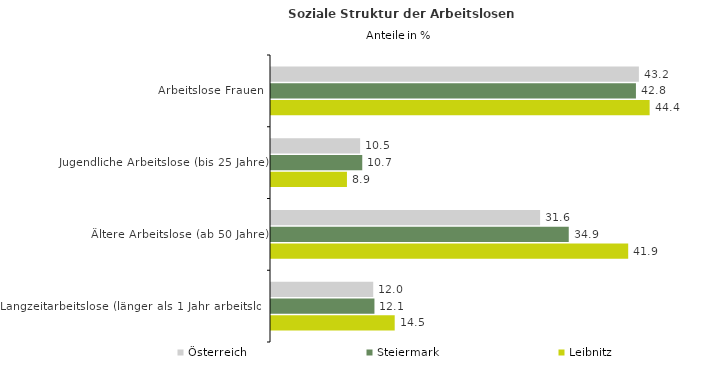
| Category | Österreich | Steiermark | Leibnitz |
|---|---|---|---|
| Arbeitslose Frauen | 43.18 | 42.833 | 44.44 |
| Jugendliche Arbeitslose (bis 25 Jahre) | 10.46 | 10.711 | 8.914 |
| Ältere Arbeitslose (ab 50 Jahre) | 31.584 | 34.947 | 41.924 |
| Langzeitarbeitslose (länger als 1 Jahr arbeitslos) | 11.999 | 12.142 | 14.519 |